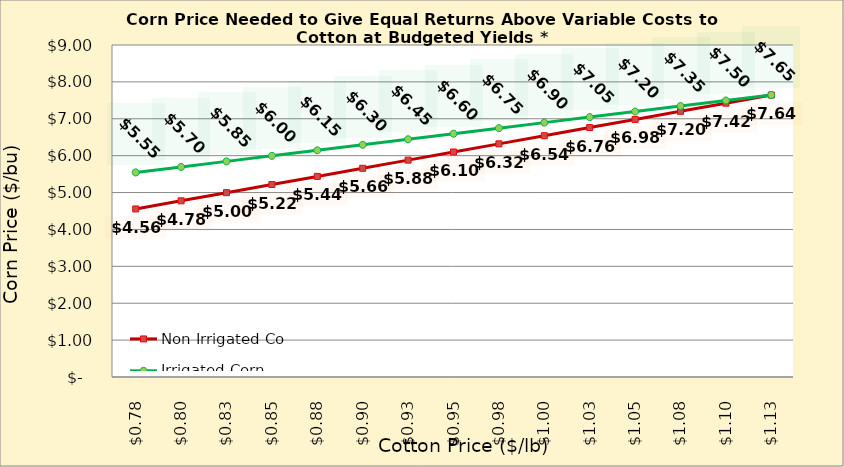
| Category | Non Irrigated Corn | Irrigated Corn |
|---|---|---|
| 0.7749999999999998 | 4.555 | 5.545 |
| 0.7999999999999998 | 4.776 | 5.695 |
| 0.8249999999999998 | 4.997 | 5.845 |
| 0.8499999999999999 | 5.217 | 5.995 |
| 0.8749999999999999 | 5.438 | 6.145 |
| 0.8999999999999999 | 5.658 | 6.295 |
| 0.9249999999999999 | 5.879 | 6.445 |
| 0.95 | 6.1 | 6.595 |
| 0.975 | 6.32 | 6.745 |
| 1.0 | 6.541 | 6.895 |
| 1.025 | 6.761 | 7.045 |
| 1.0499999999999998 | 6.982 | 7.195 |
| 1.0749999999999997 | 7.203 | 7.345 |
| 1.0999999999999996 | 7.423 | 7.495 |
| 1.1249999999999996 | 7.644 | 7.645 |